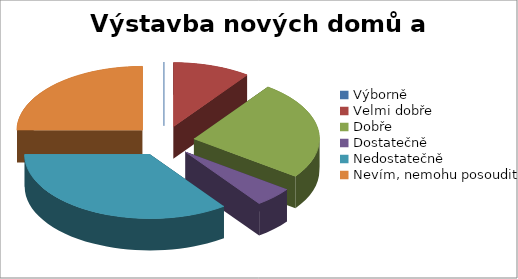
| Category | Výstavba nových domů a bytů |
|---|---|
| Výborně | 0 |
| Velmi dobře | 2 |
| Dobře | 5 |
| Dostatečně | 1 |
| Nedostatečně | 7 |
| Nevím, nemohu posoudit | 5 |